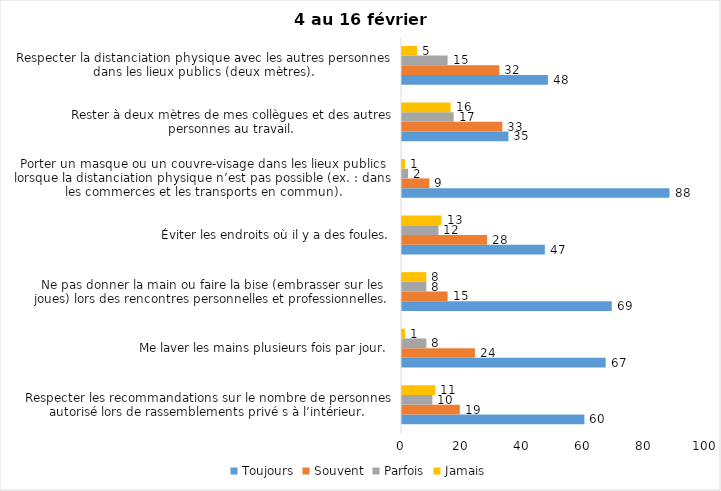
| Category | Toujours | Souvent | Parfois | Jamais |
|---|---|---|---|---|
| Respecter les recommandations sur le nombre de personnes autorisé lors de rassemblements privé s à l’intérieur. | 60 | 19 | 10 | 11 |
| Me laver les mains plusieurs fois par jour. | 67 | 24 | 8 | 1 |
| Ne pas donner la main ou faire la bise (embrasser sur les joues) lors des rencontres personnelles et professionnelles. | 69 | 15 | 8 | 8 |
| Éviter les endroits où il y a des foules. | 47 | 28 | 12 | 13 |
| Porter un masque ou un couvre-visage dans les lieux publics lorsque la distanciation physique n’est pas possible (ex. : dans les commerces et les transports en commun). | 88 | 9 | 2 | 1 |
| Rester à deux mètres de mes collègues et des autres personnes au travail. | 35 | 33 | 17 | 16 |
| Respecter la distanciation physique avec les autres personnes dans les lieux publics (deux mètres). | 48 | 32 | 15 | 5 |